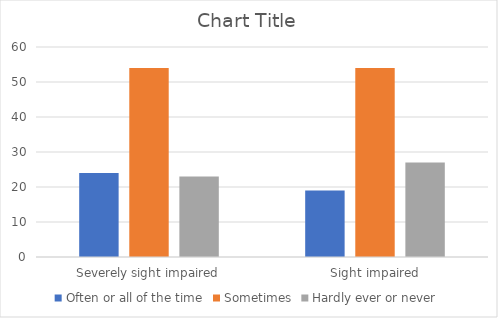
| Category | Often or all of the time | Sometimes | Hardly ever or never |
|---|---|---|---|
| Severely sight impaired | 24 | 54 | 23 |
| Sight impaired | 19 | 54 | 27 |